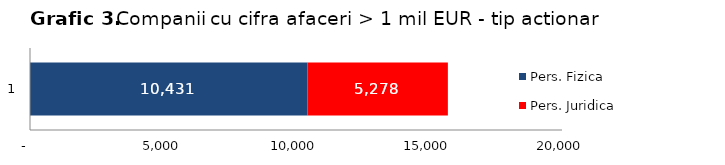
| Category | Pers. Fizica | Pers. Juridica |
|---|---|---|
| 0 | 10431 | 5278 |